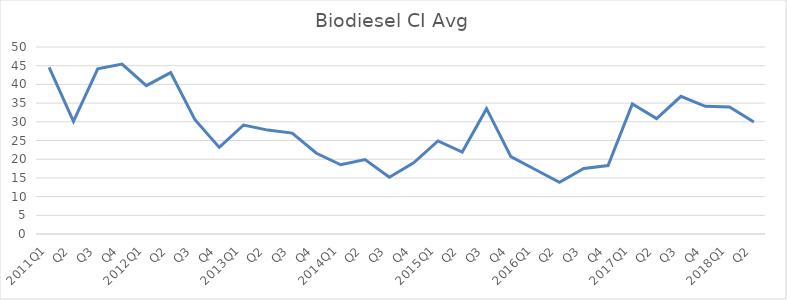
| Category | Series 0 |
|---|---|
| 2011Q1 | 44.57 |
| Q2 | 30.14 |
| Q3 | 44.16 |
| Q4 | 45.45 |
| 2012Q1 | 39.68 |
| Q2 | 43.15 |
| Q3 | 30.58 |
| Q4 | 23.16 |
| 2013Q1 | 29.14 |
| Q2 | 27.78 |
| Q3 | 26.97 |
| Q4 | 21.59 |
| 2014Q1 | 18.52 |
| Q2 | 19.91 |
| Q3 | 15.16 |
| Q4 | 19.04 |
| 2015Q1 | 24.88 |
| Q2 | 21.9 |
| Q3 | 33.51 |
| Q4 | 20.7 |
| 2016Q1 | 17.25 |
| Q2 | 13.83 |
| Q3 | 17.53 |
| Q4 | 18.31 |
| 2017Q1 | 34.76 |
| Q2 | 30.84 |
| Q3 | 36.82 |
| Q4 | 34.15 |
| 2018Q1 | 33.97 |
| Q2 | 29.94 |